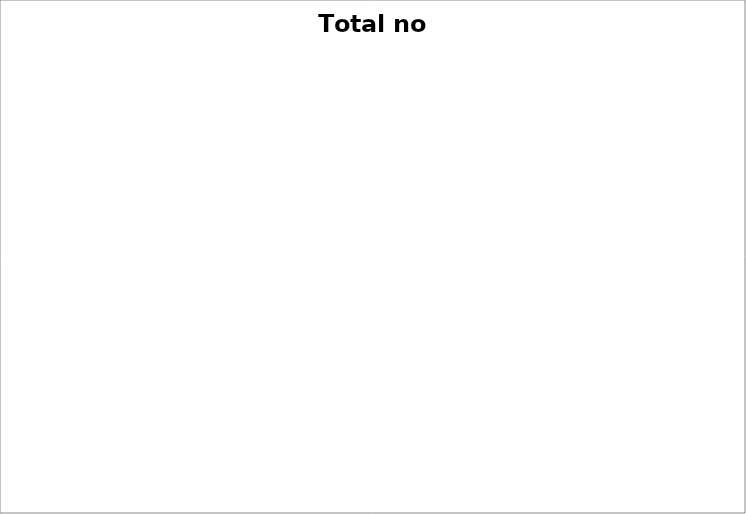
| Category | Total no Ano | Média Mensal | % Sob Despesas |
|---|---|---|---|
| Financiamento | 0 | 0 | 0 |
| Filho | 0 | 0 | 0 |
| Carro | 0 | 0 | 0 |
| Ativare | 0 | 0 | 0 |
| Dízimo | 0 | 0 | 0 |
| Mercado | 0 | 0 | 0 |
| Outros | 0 | 0 | 0 |
| Condomínio | 0 | 0 | 0 |
| Unimed | 0 | 0 | 0 |
| Lazer | 0 | 0 | 0 |
| Moto | 0 | 0 | 0 |
| Confecções | 0 | 0 | 0 |
| IPTU | 0 | 0 | 0 |
| Farmácia | 0 | 0 | 0 |
| Restaurante | 0 | 0 | 0 |
| TV Cabo | 0 | 0 | 0 |
| Telefone | 0 | 0 | 0 |
| Calçados | 0 | 0 | 0 |
| Luz | 0 | 0 | 0 |
| Internet | 0 | 0 | 0 |
| Dentista | 0 | 0 | 0 |